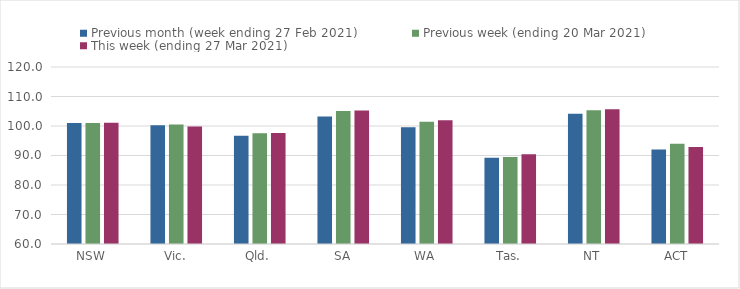
| Category | Previous month (week ending 27 Feb 2021) | Previous week (ending 20 Mar 2021) | This week (ending 27 Mar 2021) |
|---|---|---|---|
| NSW | 101.04 | 101.04 | 101.12 |
| Vic. | 100.27 | 100.49 | 99.84 |
| Qld. | 96.7 | 97.54 | 97.6 |
| SA | 103.19 | 105.11 | 105.22 |
| WA | 99.54 | 101.44 | 101.94 |
| Tas. | 89.22 | 89.52 | 90.41 |
| NT | 104.13 | 105.34 | 105.66 |
| ACT | 92 | 94 | 92.92 |